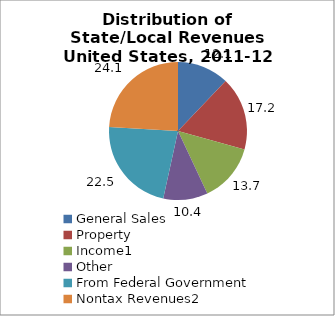
| Category | Series 0 |
|---|---|
| General Sales | 12.117 |
| Property | 17.171 |
| Income1 | 13.717 |
| Other | 10.427 |
| From Federal Government | 22.498 |
| Nontax Revenues2 | 24.05 |